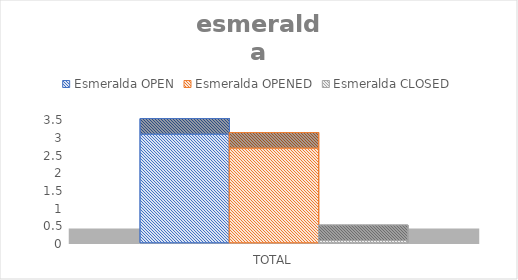
| Category | Esmeralda |
|---|---|
| TOTAL | 0.065 |